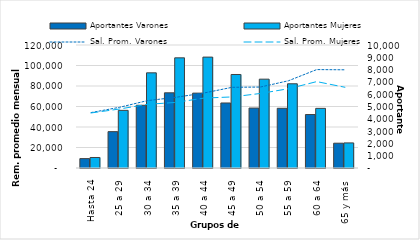
| Category | Aportantes Varones | Aportantes Mujeres |
|---|---|---|
| Hasta 24 | 763 | 854 |
| 25 a 29 | 2956 | 4685 |
| 30 a 34 | 5100 | 7737 |
| 35 a 39 | 6114 | 8957 |
| 40 a 44 | 6087 | 9016 |
| 45 a 49 | 5286 | 7602 |
| 50 a 54 | 4873 | 7223 |
| 55 a 59 | 4855 | 6848 |
| 60 a 64 | 4347 | 4848 |
| 65 y más | 2017 | 2039 |